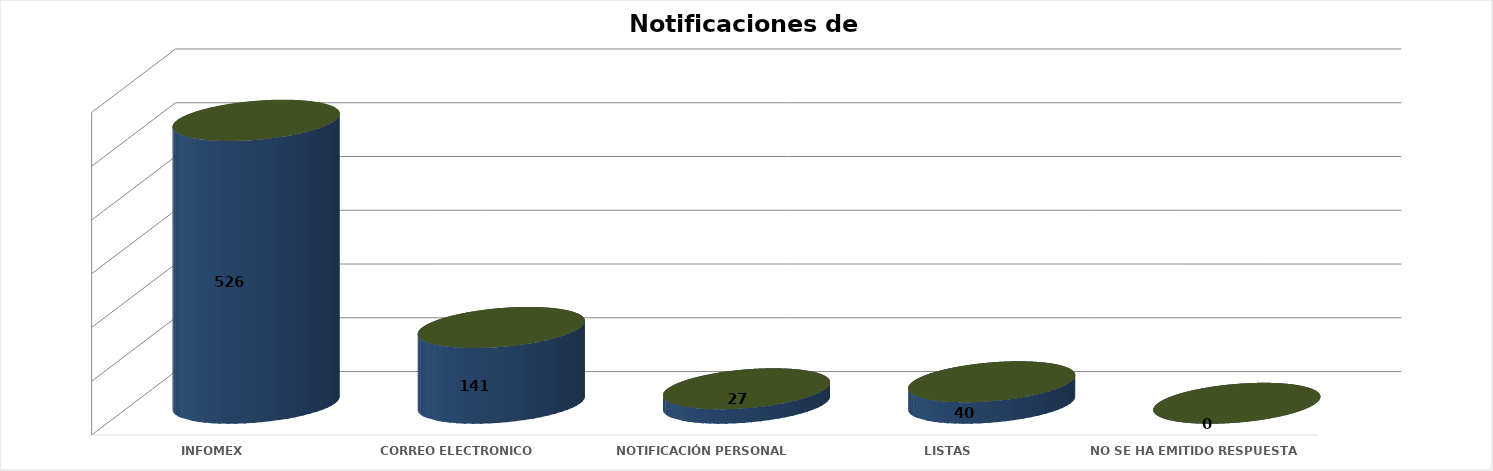
| Category | Series 0 | Series 1 | Series 2 | Series 3 | Series 4 |
|---|---|---|---|---|---|
| INFOMEX |  |  |  | 526 | 0.717 |
| CORREO ELECTRONICO |  |  |  | 141 | 0.192 |
| NOTIFICACIÓN PERSONAL |  |  |  | 27 | 0.037 |
| LISTAS |  |  |  | 40 | 0.054 |
|  NO SE HA EMITIDO RESPUESTA |  |  |  | 0 | 0 |